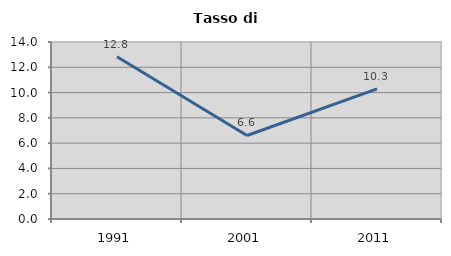
| Category | Tasso di disoccupazione   |
|---|---|
| 1991.0 | 12.827 |
| 2001.0 | 6.605 |
| 2011.0 | 10.299 |